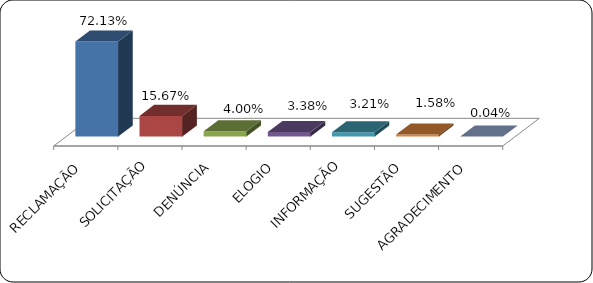
| Category | Series 0 |
|---|---|
|      RECLAMAÇÃO | 0.721 |
|      SOLICITAÇÃO | 0.157 |
|      DENÚNCIA | 0.04 |
|      ELOGIO | 0.034 |
|      INFORMAÇÃO | 0.032 |
|      SUGESTÃO | 0.016 |
|      AGRADECIMENTO | 0 |